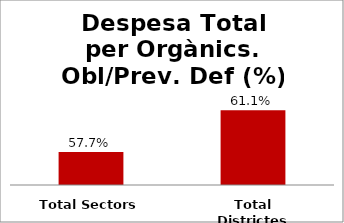
| Category | Series 0 |
|---|---|
| Total Sectors | 0.577 |
| Total Districtes | 0.611 |